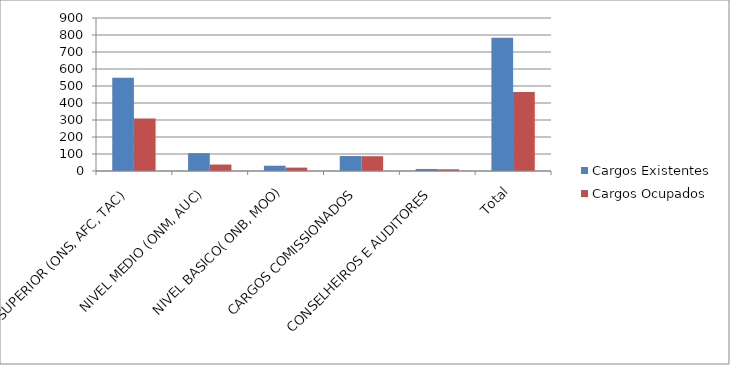
| Category | Cargos Existentes | Cargos Ocupados |
|---|---|---|
| NIVEL SUPERIOR (ONS, AFC, TAC) | 548 | 309 |
| NIVEL MEDIO (ONM, AUC) | 105 | 38 |
| NIVEL BASICO( ONB, MOO) | 31 | 20 |
| CARGOS COMISSIONADOS | 88 | 87 |
| CONSELHEIROS E AUDITORES | 12 | 10 |
| Total | 784 | 464 |